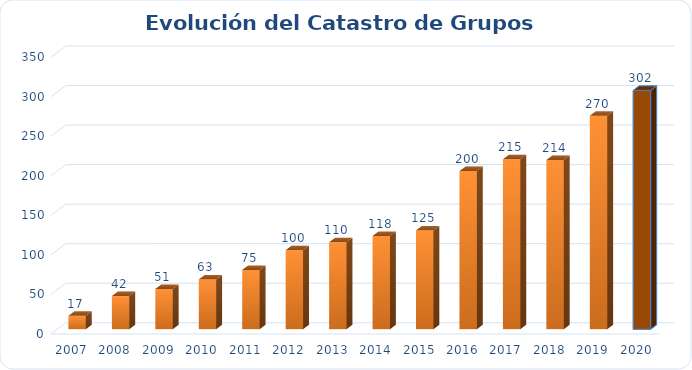
| Category | Series 0 |
|---|---|
| 2007.0 | 17 |
| 2008.0 | 42 |
| 2009.0 | 51 |
| 2010.0 | 63 |
| 2011.0 | 75 |
| 2012.0 | 100 |
| 2013.0 | 110 |
| 2014.0 | 118 |
| 2015.0 | 125 |
| 2016.0 | 200 |
| 2017.0 | 215 |
| 2018.0 | 214 |
| 2019.0 | 270 |
| 2020.0 | 302 |